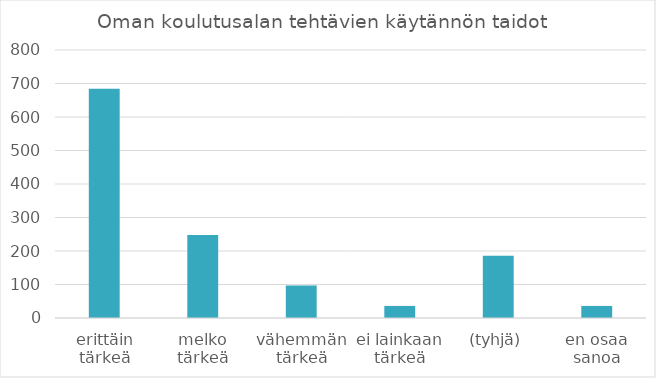
| Category | Summa |
|---|---|
| erittäin tärkeä | 684 |
| melko tärkeä | 248 |
| vähemmän tärkeä | 97 |
| ei lainkaan tärkeä | 36 |
| (tyhjä) | 186 |
| en osaa sanoa | 36 |